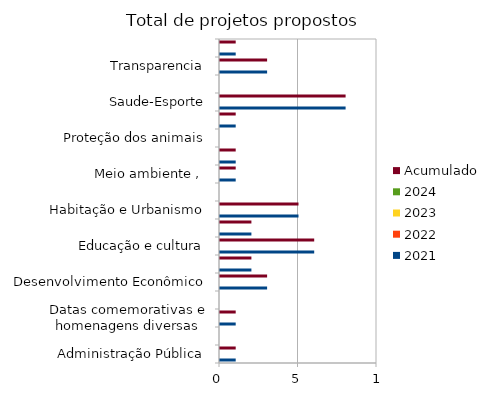
| Category | 2021 | 2022 | 2023 | 2024 | Acumulado |
|---|---|---|---|---|---|
| Administração Pública | 1 |  |  |  | 1 |
| Combate à corrupção  | 0 |  |  |  | 0 |
| Datas comemorativas e homenagens diversas | 1 |  |  |  | 1 |
| Denominação de logradouro | 0 |  |  |  | 0 |
| Desenvolvimento Econômico | 3 |  |  |  | 3 |
| Desenvolvimento Social  | 2 |  |  |  | 2 |
| Educação e cultura | 6 |  |  |  | 6 |
| Frente parlamentar | 2 |  |  |  | 2 |
| Habitação e Urbanismo | 5 |  |  |  | 5 |
| Lei Orgânica do Município | 0 |  |  |  | 0 |
| Meio ambiente ,  | 1 |  |  |  | 1 |
| Mobilidade | 1 |  |  |  | 1 |
| Proteção dos animais | 0 |  |  |  | 0 |
| Regimento Interno da CMSP | 1 |  |  |  | 1 |
| Saude-Esporte | 8 |  |  |  | 8 |
| Segurança Pública | 0 |  |  |  | 0 |
| Transparencia | 3 |  |  |  | 3 |
| Tributação | 1 |  |  |  | 1 |